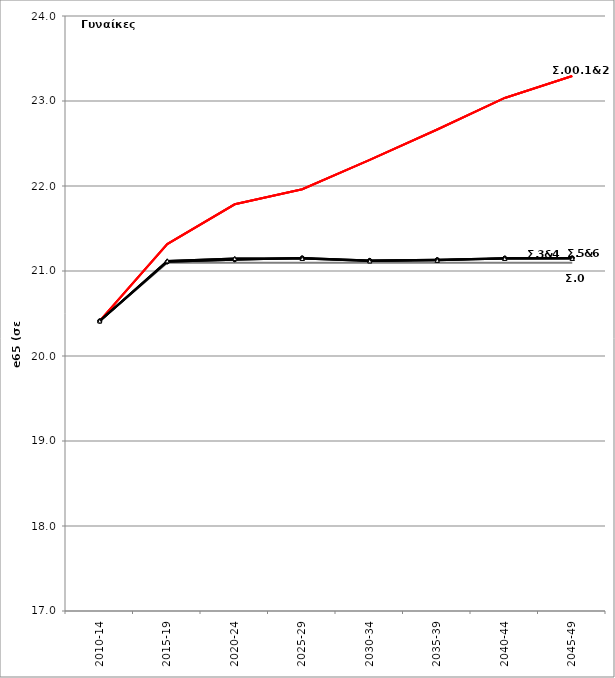
| Category | Σ0.e65 | Σ00.e65 | Σ1.e65 | Σ2.e65 | Σ3.e65 | Σ4.e65 | Σ5.e65 | Σ6.e65 |
|---|---|---|---|---|---|---|---|---|
| 2010-14 | 20.413 | 20.413 | 20.413 | 20.413 | 20.413 | 20.413 | 20.413 | 20.413 |
| 2015-19 | 21.097 | 21.317 | 21.317 | 21.317 | 21.108 | 21.108 | 21.119 | 21.119 |
| 2020-24 | 21.097 | 21.785 | 21.785 | 21.785 | 21.133 | 21.133 | 21.146 | 21.146 |
| 2025-29 | 21.097 | 21.962 | 21.962 | 21.962 | 21.153 | 21.153 | 21.147 | 21.147 |
| 2030-34 | 21.097 | 22.308 | 22.308 | 22.308 | 21.125 | 21.125 | 21.119 | 21.119 |
| 2035-39 | 21.097 | 22.665 | 22.665 | 22.665 | 21.133 | 21.133 | 21.125 | 21.125 |
| 2040-44 | 21.097 | 23.036 | 23.036 | 23.036 | 21.151 | 21.151 | 21.148 | 21.148 |
| 2045-49 | 21.097 | 23.294 | 23.294 | 23.294 | 21.154 | 21.154 | 21.148 | 21.148 |